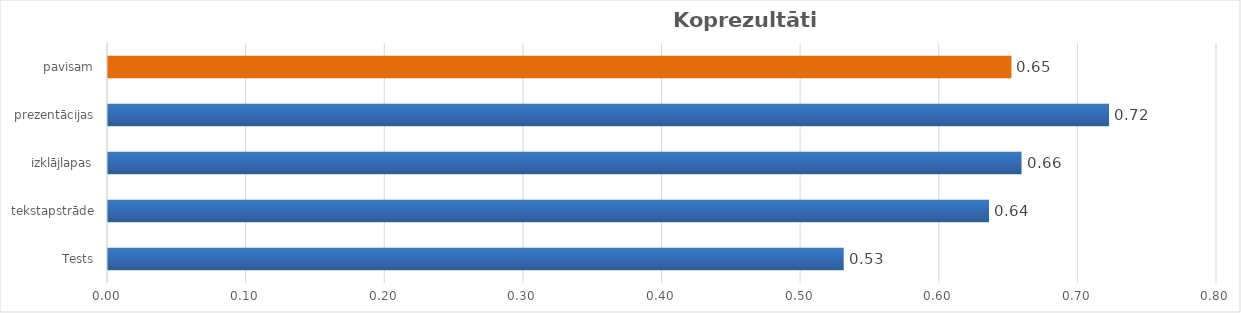
| Category | Series 0 |
|---|---|
| Tests | 0.531 |
| tekstapstrāde | 0.636 |
| izklājlapas | 0.659 |
| prezentācijas | 0.722 |
| pavisam | 0.652 |